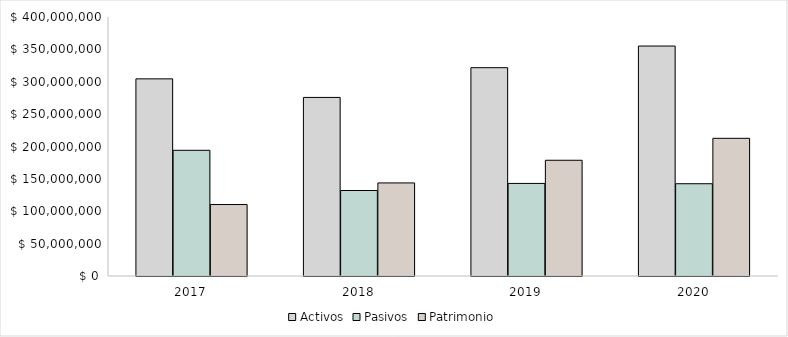
| Category |  Activos  |  Pasivos  |  Patrimonio  |
|---|---|---|---|
| 2017.0 | 304486890 | 194132705 | 110354185 |
| 2018.0 | 275777320 | 132029154 | 143748166 |
| 2019.0 | 321712481 | 142961852 | 178750629 |
| 2020.0 | 355145322 | 142506663 | 212638659 |